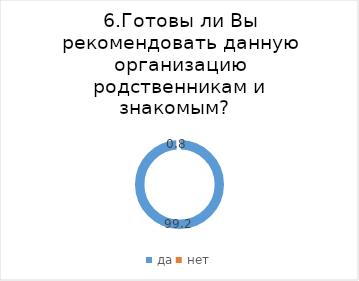
| Category | Series 0 |
|---|---|
| да | 99.232 |
| нет | 0.768 |